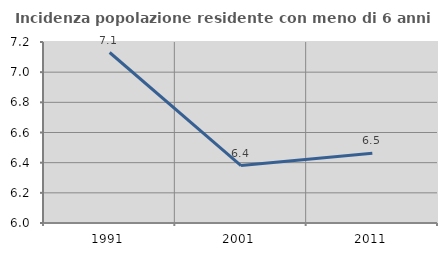
| Category | Incidenza popolazione residente con meno di 6 anni |
|---|---|
| 1991.0 | 7.13 |
| 2001.0 | 6.381 |
| 2011.0 | 6.463 |